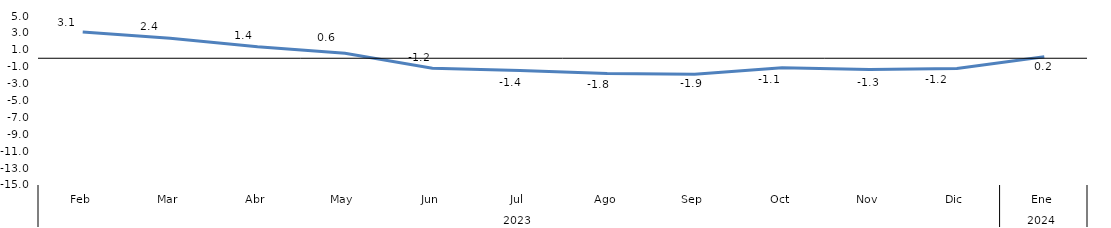
| Category | Bogotá |
|---|---|
| 0 | 3.113 |
| 1 | 2.357 |
| 2 | 1.353 |
| 3 | 0.601 |
| 4 | -1.175 |
| 5 | -1.45 |
| 6 | -1.794 |
| 7 | -1.888 |
| 8 | -1.115 |
| 9 | -1.344 |
| 10 | -1.202 |
| 11 | 0.176 |